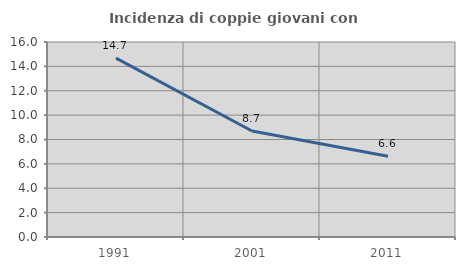
| Category | Incidenza di coppie giovani con figli |
|---|---|
| 1991.0 | 14.672 |
| 2001.0 | 8.701 |
| 2011.0 | 6.62 |